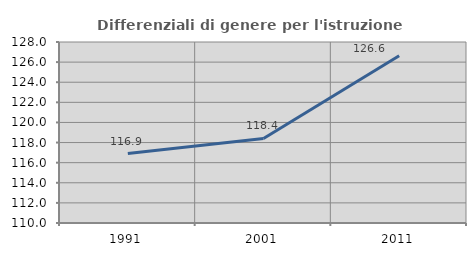
| Category | Differenziali di genere per l'istruzione superiore |
|---|---|
| 1991.0 | 116.91 |
| 2001.0 | 118.408 |
| 2011.0 | 126.633 |